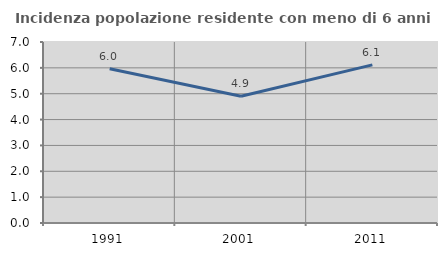
| Category | Incidenza popolazione residente con meno di 6 anni |
|---|---|
| 1991.0 | 5.964 |
| 2001.0 | 4.905 |
| 2011.0 | 6.115 |